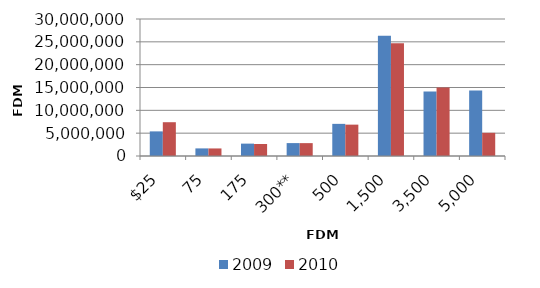
| Category | 2009 | 2010 |
|---|---|---|
| $25 | 5390894 | 7399704 |
| 75 | 1664549 | 1654634 |
| 175 | 2710127 | 2622143 |
| 300** | 2826466 | 2818780 |
| 500 | 7038247 | 6866781 |
| 1,500 | 26355217 | 24672854 |
| 3,500 | 14111640 | 15023031 |
| 5,000 | 14318751 | 5072705 |